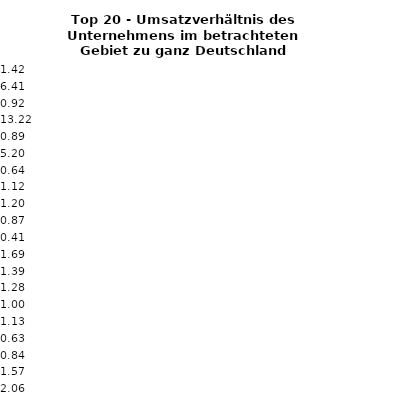
| Category | Series 0 |
|---|---|
| 0 | 1.424 |
| 1 | 6.408 |
| 2 | 0.919 |
| 3 | 13.224 |
| 4 | 0.886 |
| 5 | 5.197 |
| 6 | 0.641 |
| 7 | 1.12 |
| 8 | 1.202 |
| 9 | 0.873 |
| 10 | 0.409 |
| 11 | 1.692 |
| 12 | 1.392 |
| 13 | 1.284 |
| 14 | 1.005 |
| 15 | 1.13 |
| 16 | 0.628 |
| 17 | 0.842 |
| 18 | 1.566 |
| 19 | 2.059 |